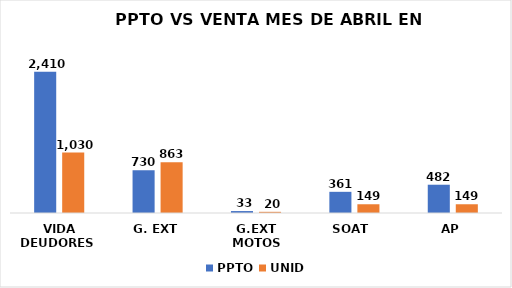
| Category |  PPTO  | UNID |
|---|---|---|
| VIDA DEUDORES  | 2409.576 | 1030 |
| G. EXT | 729.7 | 863 |
| G.EXT MOTOS | 33 | 20 |
| SOAT  | 361 | 149 |
| AP | 482 | 149 |